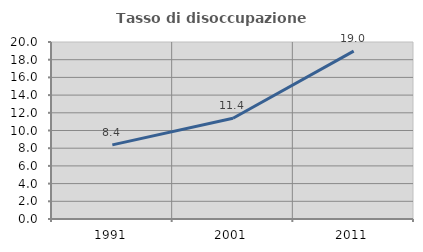
| Category | Tasso di disoccupazione giovanile  |
|---|---|
| 1991.0 | 8.374 |
| 2001.0 | 11.382 |
| 2011.0 | 18.966 |